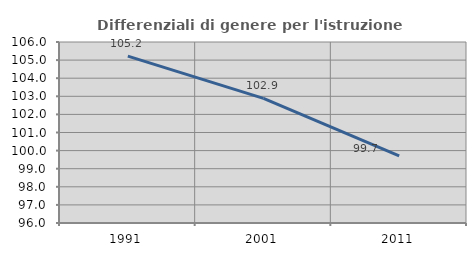
| Category | Differenziali di genere per l'istruzione superiore |
|---|---|
| 1991.0 | 105.217 |
| 2001.0 | 102.888 |
| 2011.0 | 99.703 |